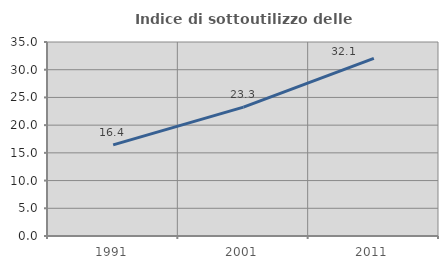
| Category | Indice di sottoutilizzo delle abitazioni  |
|---|---|
| 1991.0 | 16.436 |
| 2001.0 | 23.253 |
| 2011.0 | 32.058 |